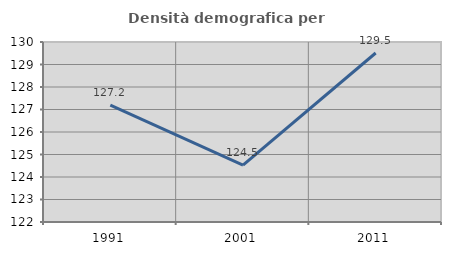
| Category | Densità demografica |
|---|---|
| 1991.0 | 127.19 |
| 2001.0 | 124.529 |
| 2011.0 | 129.512 |